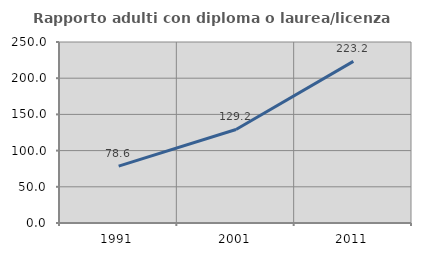
| Category | Rapporto adulti con diploma o laurea/licenza media  |
|---|---|
| 1991.0 | 78.558 |
| 2001.0 | 129.18 |
| 2011.0 | 223.232 |